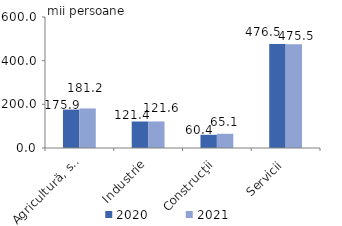
| Category | 2020 | 2021 |
|---|---|---|
| Agricultură, silvicultură şi pescuit | 175.851 | 181.184 |
| Industrie | 121.429 | 121.614 |
| Construcţii | 60.444 | 65.143 |
| Servicii | 476.466 | 475.504 |